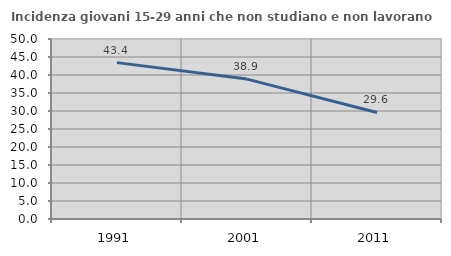
| Category | Incidenza giovani 15-29 anni che non studiano e non lavorano  |
|---|---|
| 1991.0 | 43.439 |
| 2001.0 | 38.866 |
| 2011.0 | 29.59 |